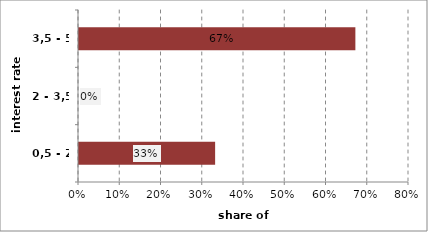
| Category | Series 0 |
|---|---|
| 0,5 - 2 | 0.33 |
| 2 - 3,5 | 0 |
| 3,5 - 5 | 0.67 |